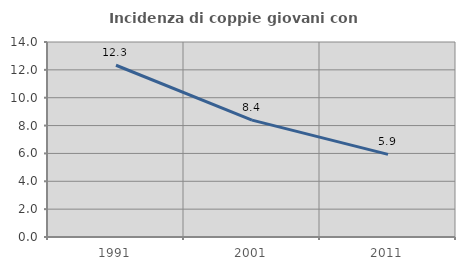
| Category | Incidenza di coppie giovani con figli |
|---|---|
| 1991.0 | 12.331 |
| 2001.0 | 8.393 |
| 2011.0 | 5.931 |